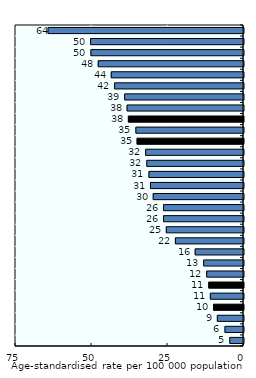
| Category | Males |
|---|---|
| Thailand | 64.3 |
| India | 50.3 |
| Viet Nam | 50.2 |
| Malaysia | 47.8 |
| Mongolia | 43.5 |
| Cambodia | 42.4 |
| Korea, DPR | 39.1 |
| Nepal | 38.3 |
| Asia Pacific-UM | 37.86 |
| Sri Lanka | 35.4 |
| Asia Pacific-LM/L | 34.993 |
| Papua New Guinea | 32.2 |
| Indonesia | 31.8 |
| Solomon Islands | 31.1 |
| Bangladesh | 30.6 |
| China | 29.7 |
| Lao, PDR | 26.3 |
| Myanmar | 26.3 |
| Pakistan | 25.4 |
| Philippines | 22.4 |
| Korea, Rep. | 15.9 |
| Brunei Darussalam | 13.1 |
| Fiji | 12.1 |
| OECD | 11.411 |
| New Zealand | 10.9 |
| Asia Pacific-H | 9.85 |
| Australia | 8.6 |
| Singapore | 6.1 |
| Japan | 4.5 |